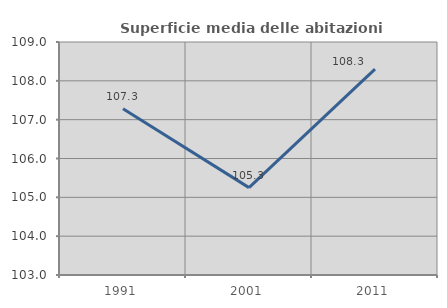
| Category | Superficie media delle abitazioni occupate |
|---|---|
| 1991.0 | 107.281 |
| 2001.0 | 105.25 |
| 2011.0 | 108.299 |